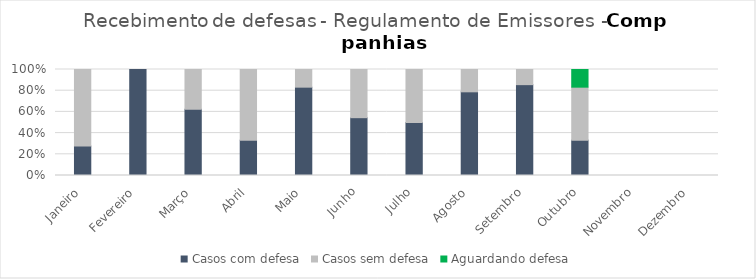
| Category | Casos com defesa | Casos sem defesa | Aguardando defesa |
|---|---|---|---|
| Janeiro | 5 | 13 | 0 |
| Fevereiro | 1 | 0 | 0 |
| Março | 5 | 3 | 0 |
| Abril | 1 | 2 | 0 |
| Maio | 25 | 5 | 0 |
| Junho | 6 | 5 | 0 |
| Julho | 5 | 5 | 0 |
| Agosto | 15 | 4 | 0 |
| Setembro | 12 | 2 | 0 |
| Outubro | 2 | 3 | 1 |
| Novembro | 0 | 0 | 0 |
| Dezembro | 0 | 0 | 0 |